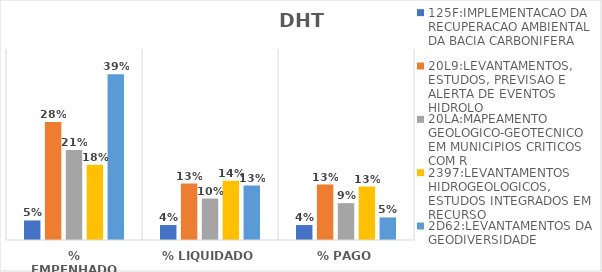
| Category | 125F:IMPLEMENTACAO DA RECUPERACAO AMBIENTAL DA BACIA CARBONIFERA | 20L9:LEVANTAMENTOS, ESTUDOS, PREVISAO E ALERTA DE EVENTOS HIDROLO | 20LA:MAPEAMENTO GEOLOGICO-GEOTECNICO EM MUNICIPIOS CRITICOS COM R | 2397:LEVANTAMENTOS HIDROGEOLOGICOS, ESTUDOS INTEGRADOS EM RECURSO | 2D62:LEVANTAMENTOS DA GEODIVERSIDADE |
|---|---|---|---|---|---|
| % EMPENHADO | 0.046 | 0.278 | 0.212 | 0.177 | 0.39 |
| % LIQUIDADO | 0.035 | 0.133 | 0.098 | 0.14 | 0.128 |
| % PAGO | 0.035 | 0.131 | 0.087 | 0.126 | 0.053 |